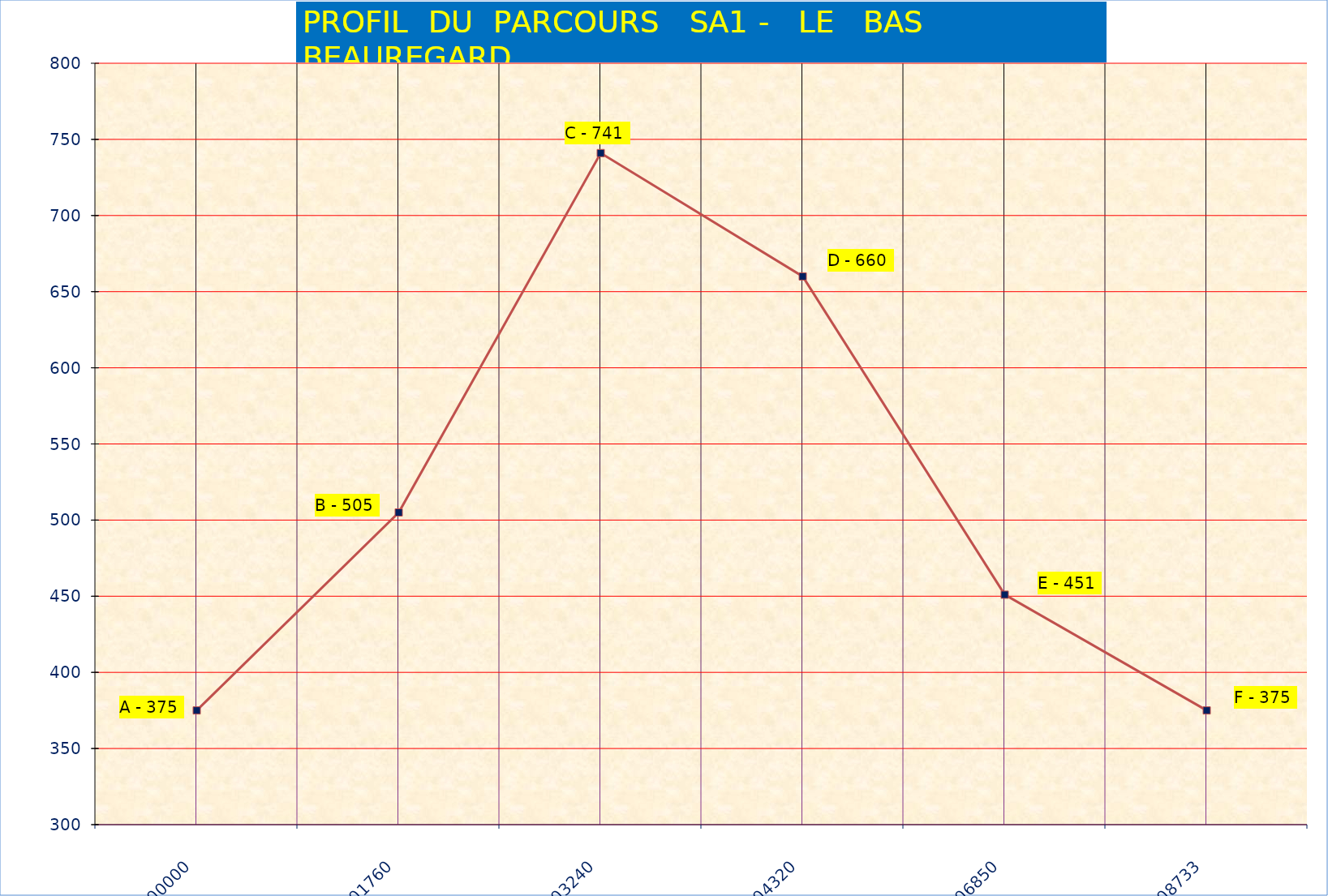
| Category | Series 1 |
|---|---|
| 0.0 | 375 |
| 1760.0 | 505 |
| 3240.0 | 741 |
| 4320.0 | 660 |
| 6850.0 | 451 |
| 8733.0 | 375 |